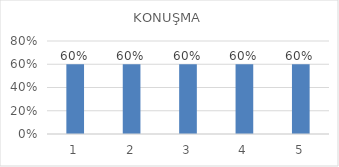
| Category | Series 0 |
|---|---|
| 0 | 0.6 |
| 1 | 0.6 |
| 2 | 0.6 |
| 3 | 0.6 |
| 4 | 0.6 |